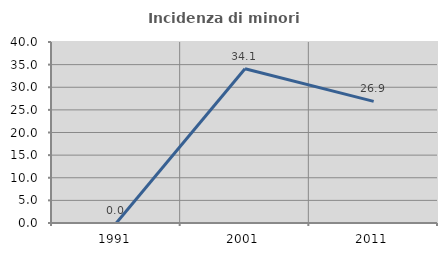
| Category | Incidenza di minori stranieri |
|---|---|
| 1991.0 | 0 |
| 2001.0 | 34.091 |
| 2011.0 | 26.887 |